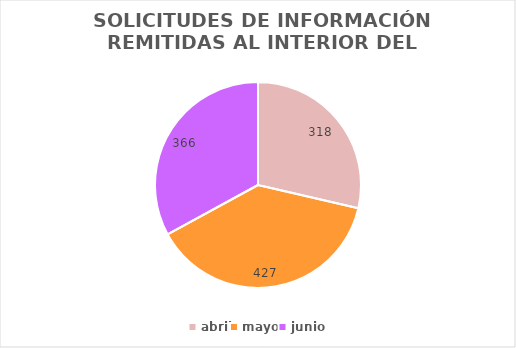
| Category | SOLICITUDES DE INFORMACIÓN REMITIDAS AL INTERIOR DEL CONGRESO  |
|---|---|
| abril | 318 |
| mayo | 427 |
| junio | 366 |